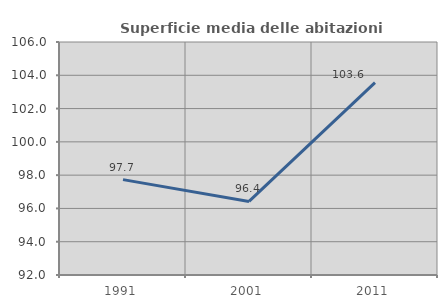
| Category | Superficie media delle abitazioni occupate |
|---|---|
| 1991.0 | 97.73 |
| 2001.0 | 96.42 |
| 2011.0 | 103.554 |